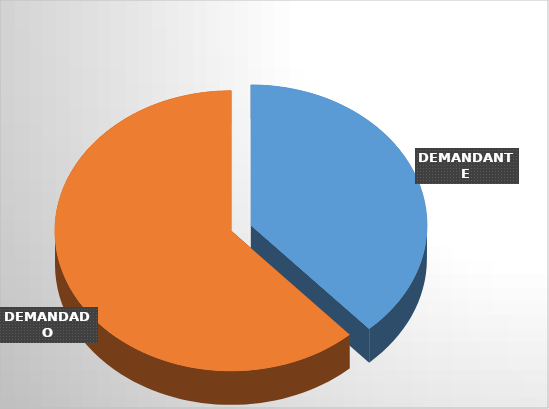
| Category | Series 0 | Series 1 |
|---|---|---|
| DEMANDANTE | 31 | 3037521327 |
| DEMANDADO | 50 | 2606519204240 |